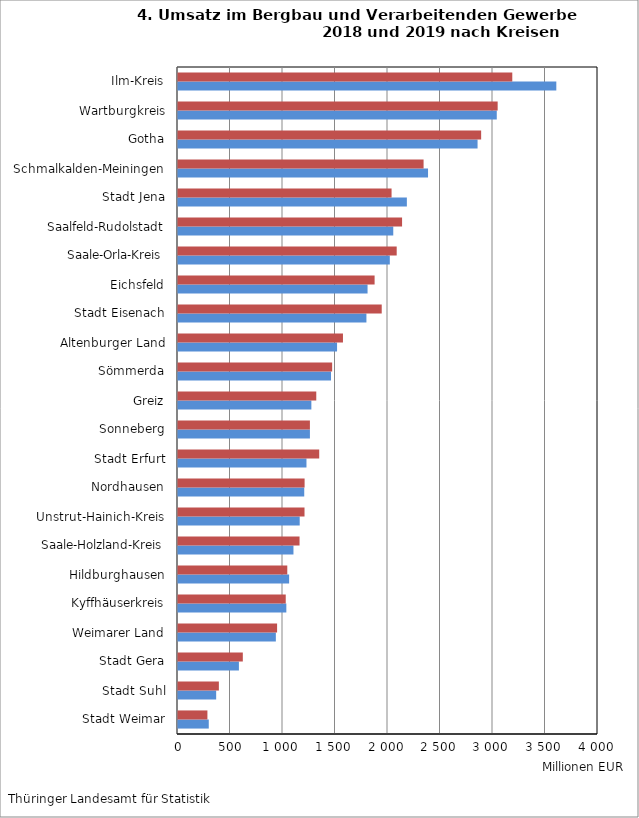
| Category | 2019 | 2018 |
|---|---|---|
| Stadt Weimar | 293.001 | 280.141 |
| Stadt Suhl | 363.513 | 389.18 |
| Stadt Gera | 580.069 | 617.327 |
| Weimarer Land | 931.91 | 943.688 |
| Kyffhäuserkreis | 1031.801 | 1026.09 |
| Hildburghausen | 1058.338 | 1040.765 |
| Saale-Holzland-Kreis | 1099.594 | 1157.619 |
| Unstrut-Hainich-Kreis | 1159.141 | 1204.924 |
| Nordhausen | 1202.22 | 1205.757 |
| Stadt Erfurt | 1223.476 | 1344.963 |
| Sonneberg | 1256.368 | 1256.251 |
| Greiz | 1270.149 | 1316.914 |
| Sömmerda | 1457.245 | 1468.151 |
| Altenburger Land | 1514.874 | 1571.086 |
| Stadt Eisenach | 1794.515 | 1940.2 |
| Eichsfeld | 1805.312 | 1872.431 |
| Saale-Orla-Kreis | 2017.242 | 2082.854 |
| Saalfeld-Rudolstadt | 2050.147 | 2134.01 |
| Stadt Jena | 2179.629 | 2033.988 |
| Schmalkalden-Meiningen | 2381.252 | 2338.876 |
| Gotha | 2853.047 | 2887.094 |
| Wartburgkreis | 3035.941 | 3044.398 |
| Ilm-Kreis | 3603.017 | 3183.665 |